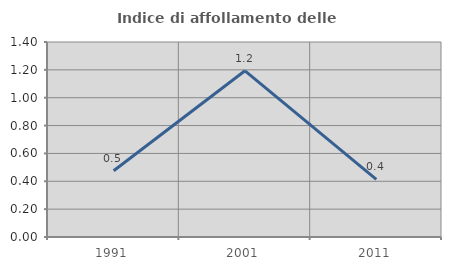
| Category | Indice di affollamento delle abitazioni  |
|---|---|
| 1991.0 | 0.475 |
| 2001.0 | 1.193 |
| 2011.0 | 0.413 |